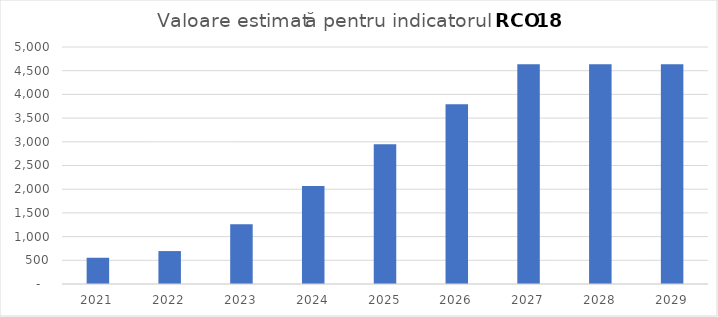
| Category | Series 0 |
|---|---|
| 2021.0 | 553.934 |
| 2022.0 | 694.765 |
| 2023.0 | 1258.088 |
| 2024.0 | 2065.518 |
| 2025.0 | 2948.058 |
| 2026.0 | 3793.042 |
| 2027.0 | 4638.027 |
| 2028.0 | 4638.027 |
| 2029.0 | 4638.027 |